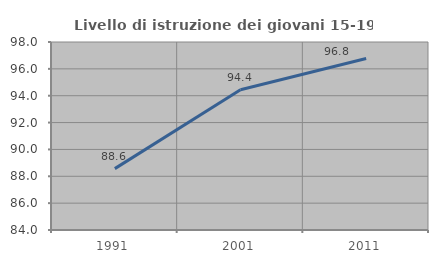
| Category | Livello di istruzione dei giovani 15-19 anni |
|---|---|
| 1991.0 | 88.571 |
| 2001.0 | 94.444 |
| 2011.0 | 96.774 |